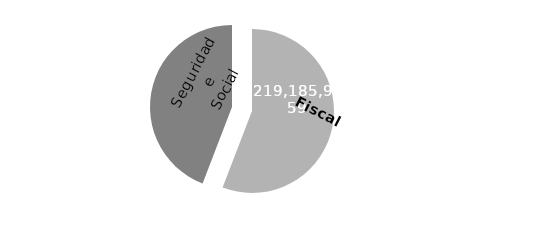
| Category | Series 0 | Series 1 | Series 2 |
|---|---|---|---|
| 0 | 0 |  |  |
| 1 | 219185983.59 |  |  |
| 2 | 173359071.79 |  |  |